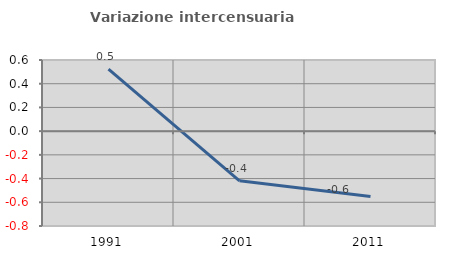
| Category | Variazione intercensuaria annua |
|---|---|
| 1991.0 | 0.523 |
| 2001.0 | -0.419 |
| 2011.0 | -0.551 |